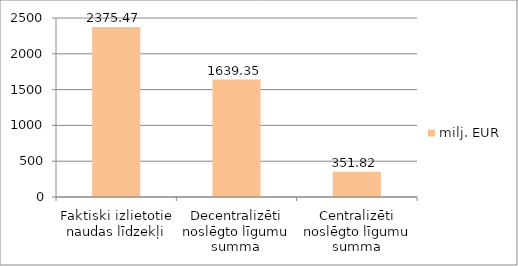
| Category | milj. EUR |
|---|---|
| Faktiski izlietotie naudas līdzekļi | 2375.47 |
| Decentralizēti noslēgto līgumu summa | 1639.35 |
| Centralizēti noslēgto līgumu summa | 351.82 |